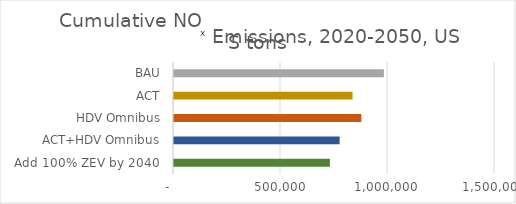
| Category | Cumulative NOx Emissions, 2020-2050, US tons |
|---|---|
|  Add 100% ZEV by 2040  | 728599.852 |
| ACT+HDV Omnibus | 773920 |
| HDV Omnibus | 875350 |
| ACT | 834410 |
| BAU | 980840 |